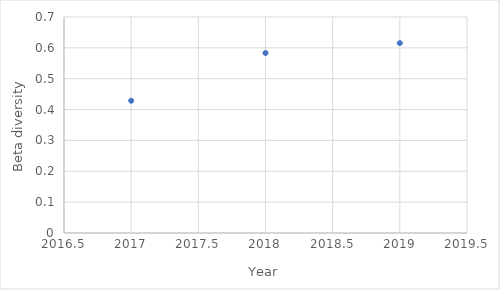
| Category | Beta div. |
|---|---|
| 2017.0 | 0.429 |
| 2018.0 | 0.583 |
| 2019.0 | 0.615 |